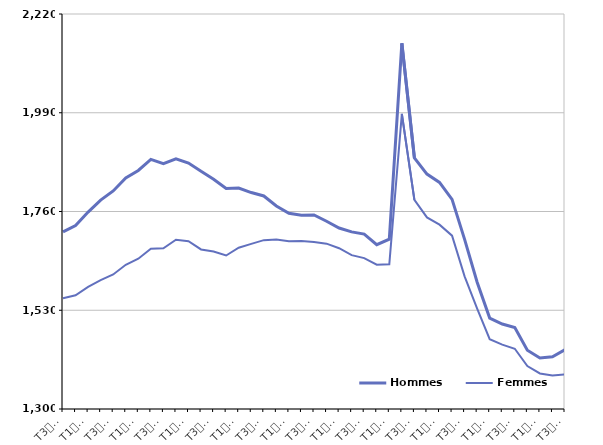
| Category | Hommes  | Femmes  |
|---|---|---|
| T3
2013 | 1712.4 | 1557.9 |
| T4
2013 | 1727.4 | 1564.9 |
| T1
2014 | 1758.7 | 1584.6 |
| T2
2014 | 1786.4 | 1600.2 |
| T3
2014 | 1807.9 | 1613.4 |
| T4
2014 | 1837.9 | 1636 |
| T1
2015 | 1855.6 | 1650 |
| T2
2015 | 1881.3 | 1673.4 |
| T3
2015 | 1871.3 | 1674.2 |
| T4
2015 | 1882.7 | 1694.1 |
| T1
2016 | 1872.7 | 1690.8 |
| T2
2016 | 1853.5 | 1671.6 |
| T3
2016 | 1835.3 | 1667 |
| T4
2016 | 1813.8 | 1657.5 |
| T1
2017 | 1814.6 | 1675.6 |
| T2
2017 | 1804.1 | 1684.5 |
| T3
2017 | 1796.2 | 1693.3 |
| T4
2017 | 1772.8 | 1694.5 |
| T1
2018 | 1755.9 | 1690.9 |
| T2
2018 | 1751.1 | 1691.5 |
| T3
2018 | 1752 | 1688.8 |
| T4
2018 | 1737.3 | 1685.1 |
| T1
2019 | 1721.5 | 1674.5 |
| T2
2019 | 1712.6 | 1658.4 |
| T3
2019 | 1707.3 | 1651.4 |
| T4
2019 | 1682.6 | 1636.1 |
| T1
2020 | 1695.4 | 1637.2 |
| T2
2020 | 2151.8 | 1987.2 |
| T3
2020 | 1884.9 | 1787.3 |
| T4
2020 | 1847.2 | 1746.2 |
| T1
2021 | 1827.6 | 1729.4 |
| T2
2021 | 1788.2 | 1703.7 |
| T3
2021 | 1695 | 1608.9 |
| T4
2021 | 1595.2 | 1533.6 |
| T1
2022 | 1511.8 | 1462.6 |
| T2
2022 | 1498 | 1449.8 |
| T3
2022 | 1489.5 | 1440.3 |
| T4
2022 | 1436.9 | 1400 |
| T1
2023 | 1418.7 | 1382.8 |
| T2
2023 | 1421.7 | 1377.9 |
| T3
2023 | 1438 | 1380.8 |